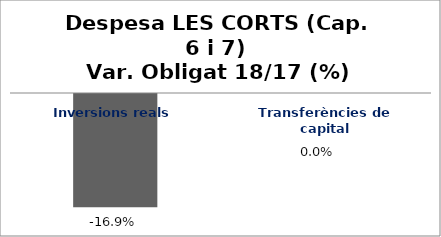
| Category | Series 0 |
|---|---|
| Inversions reals | -0.169 |
| Transferències de capital | 0 |